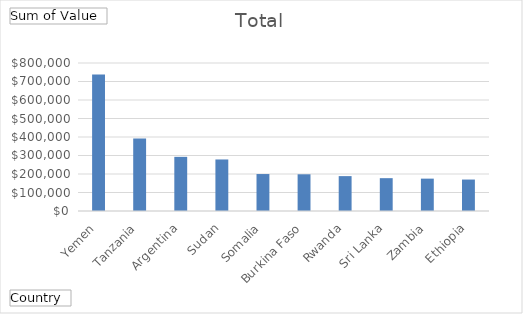
| Category | Total |
|---|---|
| Yemen | 737772 |
| Tanzania | 391495 |
| Argentina | 292740 |
| Sudan | 278545 |
| Somalia | 199800 |
| Burkina Faso | 198450 |
| Rwanda | 188576 |
| Sri Lanka | 177480 |
| Zambia | 174933 |
| Ethiopia | 170000 |